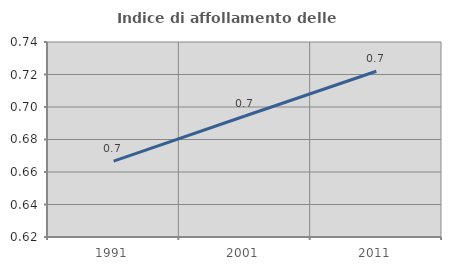
| Category | Indice di affollamento delle abitazioni  |
|---|---|
| 1991.0 | 0.667 |
| 2001.0 | 0.694 |
| 2011.0 | 0.722 |